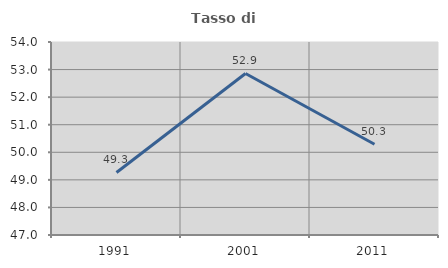
| Category | Tasso di occupazione   |
|---|---|
| 1991.0 | 49.267 |
| 2001.0 | 52.859 |
| 2011.0 | 50.292 |